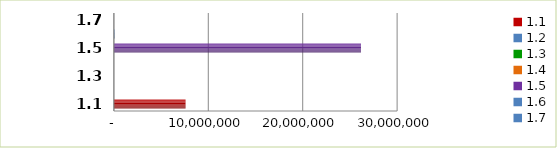
| Category | Series 0 |
|---|---|
| 1.1 | 7588655.1 |
| 1.2 | 0 |
| 1.3 | 0 |
| 1.4 | 0 |
| 1.5 | 26172251 |
| 1.6 | 63097.1 |
| 1.7 | 0 |